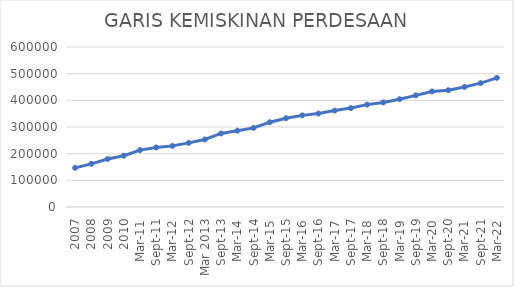
| Category | GARIS KEMISKINAN PERDESAAN |
|---|---|
| 2007 | 146837 |
| 2008 | 161830.79 |
| 2009 | 179834.57 |
| 2010 | 192353.83 |
| Mar-11 | 213395 |
| Sep-11 | 223181 |
| Mar-12 | 229225.78 |
| Sep-12 | 240441 |
| Mar 2013 | 253273.31 |
| Sep-13 | 275779 |
| Mar-14 | 286097 |
| Sep-14 | 296681 |
| Mar-15 | 317881 |
| Sep-15 | 333034 |
| Mar-16 | 343646.772 |
| Sep-16 | 350420 |
| Mar-17 | 361496 |
| Sep-17 | 370910 |
| Mar-18 | 383908 |
| Sep-18 | 392154 |
| Mar-19 | 404398 |
| Sep-19 | 418515 |
| Mar-20 | 433281 |
| Sep-20 | 437902 |
| Mar-21 | 450185 |
| Sep-21 | 464474 |
| Mar-22 | 484209 |